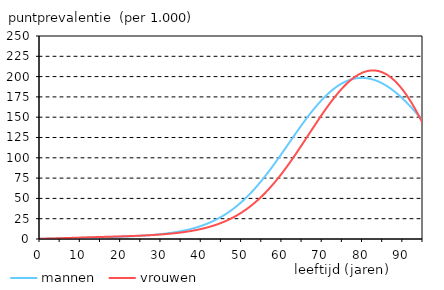
| Category | mannen | vrouwen |
|---|---|---|
| 0.0 | 0.301 | 0.309 |
| 1.0 | 0.38 | 0.407 |
| 2.0 | 0.467 | 0.52 |
| 3.0 | 0.562 | 0.646 |
| 4.0 | 0.665 | 0.786 |
| 5.0 | 0.773 | 0.934 |
| 6.0 | 0.885 | 1.09 |
| 7.0 | 1.001 | 1.251 |
| 8.0 | 1.119 | 1.413 |
| 9.0 | 1.239 | 1.575 |
| 10.0 | 1.36 | 1.736 |
| 11.0 | 1.483 | 1.893 |
| 12.0 | 1.608 | 2.047 |
| 13.0 | 1.735 | 2.197 |
| 14.0 | 1.865 | 2.344 |
| 15.0 | 2 | 2.489 |
| 16.0 | 2.14 | 2.631 |
| 17.0 | 2.287 | 2.774 |
| 18.0 | 2.443 | 2.917 |
| 19.0 | 2.61 | 3.064 |
| 20.0 | 2.791 | 3.216 |
| 21.0 | 2.986 | 3.376 |
| 22.0 | 3.2 | 3.545 |
| 23.0 | 3.436 | 3.726 |
| 24.0 | 3.696 | 3.921 |
| 25.0 | 3.984 | 4.134 |
| 26.0 | 4.305 | 4.367 |
| 27.0 | 4.663 | 4.624 |
| 28.0 | 5.063 | 4.908 |
| 29.0 | 5.512 | 5.224 |
| 30.0 | 6.016 | 5.574 |
| 31.0 | 6.582 | 5.965 |
| 32.0 | 7.218 | 6.402 |
| 33.0 | 7.934 | 6.889 |
| 34.0 | 8.739 | 7.435 |
| 35.0 | 9.644 | 8.045 |
| 36.0 | 10.662 | 8.728 |
| 37.0 | 11.806 | 9.493 |
| 38.0 | 13.09 | 10.35 |
| 39.0 | 14.53 | 11.308 |
| 40.0 | 16.142 | 12.38 |
| 41.0 | 17.943 | 13.579 |
| 42.0 | 19.951 | 14.917 |
| 43.0 | 22.185 | 16.41 |
| 44.0 | 24.663 | 18.073 |
| 45.0 | 27.405 | 19.923 |
| 46.0 | 30.426 | 21.976 |
| 47.0 | 33.746 | 24.252 |
| 48.0 | 37.377 | 26.767 |
| 49.0 | 41.333 | 29.539 |
| 50.0 | 45.622 | 32.588 |
| 51.0 | 50.251 | 35.929 |
| 52.0 | 55.221 | 39.577 |
| 53.0 | 60.527 | 43.548 |
| 54.0 | 66.16 | 47.852 |
| 55.0 | 72.104 | 52.497 |
| 56.0 | 78.337 | 57.489 |
| 57.0 | 84.832 | 62.826 |
| 58.0 | 91.553 | 68.506 |
| 59.0 | 98.462 | 74.517 |
| 60.0 | 105.511 | 80.844 |
| 61.0 | 112.652 | 87.465 |
| 62.0 | 119.83 | 94.352 |
| 63.0 | 126.99 | 101.47 |
| 64.0 | 134.072 | 108.78 |
| 65.0 | 141.02 | 116.234 |
| 66.0 | 147.775 | 123.781 |
| 67.0 | 154.282 | 131.366 |
| 68.0 | 160.488 | 138.929 |
| 69.0 | 166.342 | 146.407 |
| 70.0 | 171.801 | 153.737 |
| 71.0 | 176.824 | 160.852 |
| 72.0 | 181.376 | 167.686 |
| 73.0 | 185.428 | 174.176 |
| 74.0 | 188.956 | 180.257 |
| 75.0 | 191.942 | 185.869 |
| 76.0 | 194.373 | 190.952 |
| 77.0 | 196.24 | 195.451 |
| 78.0 | 197.543 | 199.316 |
| 79.0 | 198.281 | 202.497 |
| 80.0 | 198.461 | 204.951 |
| 81.0 | 198.091 | 206.641 |
| 82.0 | 197.185 | 207.53 |
| 83.0 | 195.756 | 207.591 |
| 84.0 | 193.821 | 206.798 |
| 85.0 | 191.399 | 205.134 |
| 86.0 | 188.509 | 202.587 |
| 87.0 | 185.173 | 199.15 |
| 88.0 | 181.409 | 194.825 |
| 89.0 | 177.241 | 189.624 |
| 90.0 | 172.688 | 183.565 |
| 91.0 | 167.771 | 176.679 |
| 92.0 | 162.512 | 169.008 |
| 93.0 | 156.93 | 160.608 |
| 94.0 | 151.046 | 151.548 |
| 95.0 | 144.88 | 141.911 |